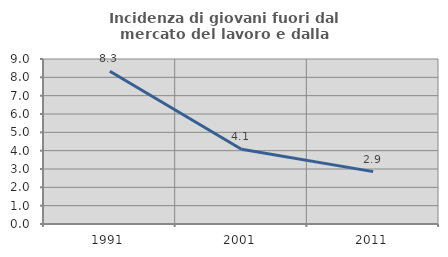
| Category | Incidenza di giovani fuori dal mercato del lavoro e dalla formazione  |
|---|---|
| 1991.0 | 8.333 |
| 2001.0 | 4.082 |
| 2011.0 | 2.857 |